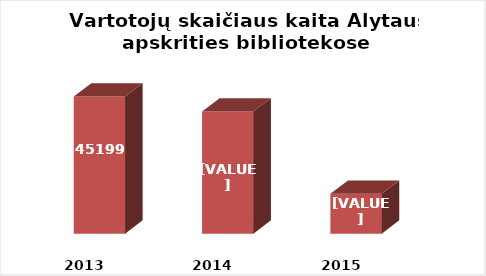
| Category | Series 0 |
|---|---|
| 2013.0 | 45199 |
| 2014.0 | 44960 |
| 2015.0 | 43641 |